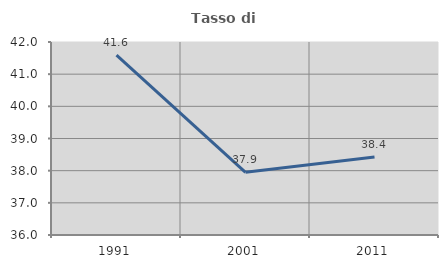
| Category | Tasso di occupazione   |
|---|---|
| 1991.0 | 41.592 |
| 2001.0 | 37.949 |
| 2011.0 | 38.427 |